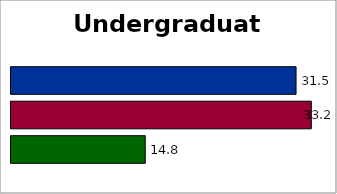
| Category | State | SREB states | 50 states and D.C. |
|---|---|---|---|
| 0 | 14.823 | 33.158 | 31.473 |